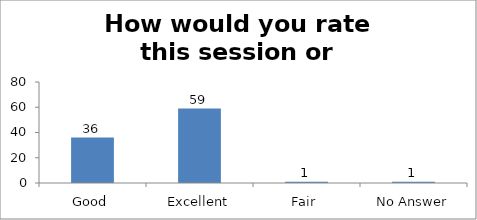
| Category | How would you rate this session or workshop? |
|---|---|
| Good | 36 |
| Excellent | 59 |
| Fair | 1 |
| No Answer | 1 |